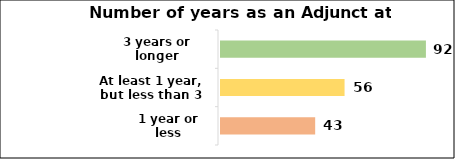
| Category | Number of years as an Adjunct at VU |
|---|---|
| 3 years or longer | 92 |
| At least 1 year, but less than 3 years | 56 |
| 1 year or less | 43 |